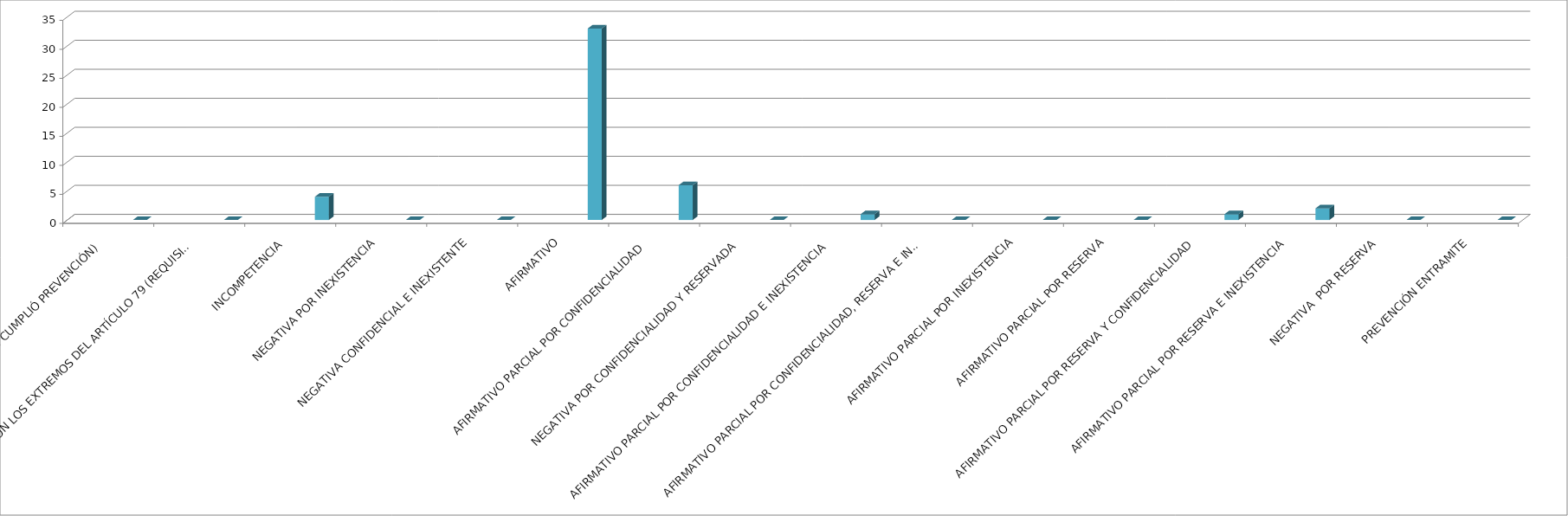
| Category | Series 0 | Series 1 | Series 2 | Series 3 | Series 4 |
|---|---|---|---|---|---|
| SE TIENE POR NO PRESENTADA ( NO CUMPLIÓ PREVENCIÓN) |  |  |  |  | 0 |
| NO CUMPLIO CON LOS EXTREMOS DEL ARTÍCULO 79 (REQUISITOS) |  |  |  |  | 0 |
| INCOMPETENCIA  |  |  |  |  | 4 |
| NEGATIVA POR INEXISTENCIA |  |  |  |  | 0 |
| NEGATIVA CONFIDENCIAL E INEXISTENTE |  |  |  |  | 0 |
| AFIRMATIVO |  |  |  |  | 33 |
| AFIRMATIVO PARCIAL POR CONFIDENCIALIDAD  |  |  |  |  | 6 |
| NEGATIVA POR CONFIDENCIALIDAD Y RESERVADA |  |  |  |  | 0 |
| AFIRMATIVO PARCIAL POR CONFIDENCIALIDAD E INEXISTENCIA |  |  |  |  | 1 |
| AFIRMATIVO PARCIAL POR CONFIDENCIALIDAD, RESERVA E INEXISTENCIA |  |  |  |  | 0 |
| AFIRMATIVO PARCIAL POR INEXISTENCIA |  |  |  |  | 0 |
| AFIRMATIVO PARCIAL POR RESERVA |  |  |  |  | 0 |
| AFIRMATIVO PARCIAL POR RESERVA Y CONFIDENCIALIDAD |  |  |  |  | 1 |
| AFIRMATIVO PARCIAL POR RESERVA E INEXISTENCIA |  |  |  |  | 2 |
| NEGATIVA  POR RESERVA |  |  |  |  | 0 |
| PREVENCIÓN ENTRAMITE |  |  |  |  | 0 |